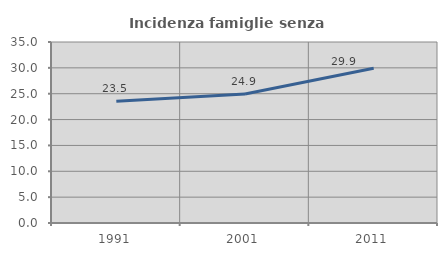
| Category | Incidenza famiglie senza nuclei |
|---|---|
| 1991.0 | 23.548 |
| 2001.0 | 24.95 |
| 2011.0 | 29.92 |